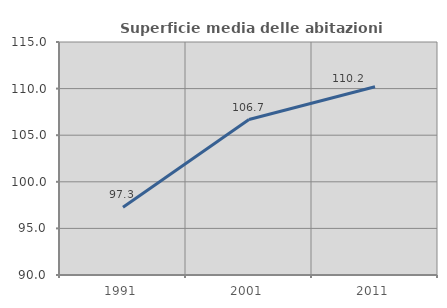
| Category | Superficie media delle abitazioni occupate |
|---|---|
| 1991.0 | 97.28 |
| 2001.0 | 106.684 |
| 2011.0 | 110.192 |